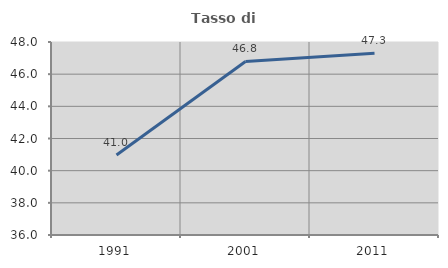
| Category | Tasso di occupazione   |
|---|---|
| 1991.0 | 40.974 |
| 2001.0 | 46.788 |
| 2011.0 | 47.295 |